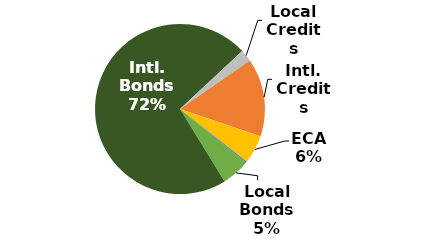
| Category | Series 0 |
|---|---|
| Local Bonds | 0.054 |
| Intl. Bonds | 0.718 |
| Local Credits | 0.023 |
| Intl. Credits | 0.148 |
| ECA | 0.055 |
| Local Leasing | 0.002 |